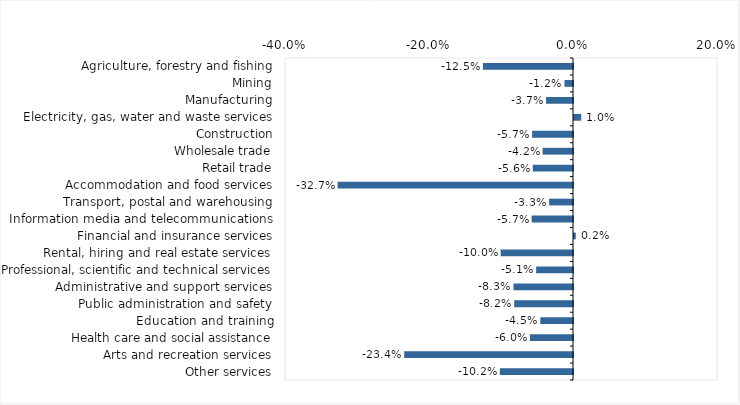
| Category | This week |
|---|---|
| Agriculture, forestry and fishing | -0.125 |
| Mining | -0.012 |
| Manufacturing | -0.037 |
| Electricity, gas, water and waste services | 0.01 |
| Construction | -0.057 |
| Wholesale trade | -0.042 |
| Retail trade | -0.056 |
| Accommodation and food services | -0.327 |
| Transport, postal and warehousing | -0.033 |
| Information media and telecommunications | -0.057 |
| Financial and insurance services | 0.002 |
| Rental, hiring and real estate services | -0.1 |
| Professional, scientific and technical services | -0.051 |
| Administrative and support services | -0.083 |
| Public administration and safety | -0.082 |
| Education and training | -0.045 |
| Health care and social assistance | -0.06 |
| Arts and recreation services | -0.234 |
| Other services | -0.102 |